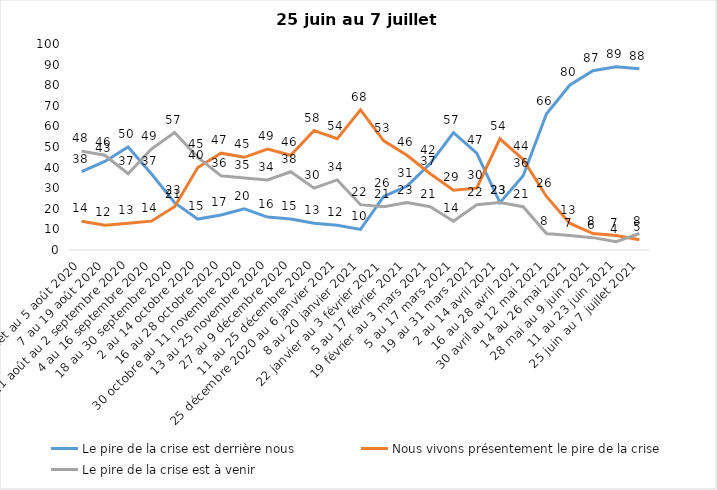
| Category | Le pire de la crise est derrière nous | Nous vivons présentement le pire de la crise | Le pire de la crise est à venir |
|---|---|---|---|
| 24 juillet au 5 août 2020 | 38 | 14 | 48 |
| 7 au 19 août 2020 | 43 | 12 | 46 |
| 21 août au 2 septembre 2020 | 50 | 13 | 37 |
| 4 au 16 septembre 2020 | 37 | 14 | 49 |
| 18 au 30 septembre 2020 | 23 | 21 | 57 |
| 2 au 14 octobre 2020 | 15 | 40 | 45 |
| 16 au 28 octobre 2020 | 17 | 47 | 36 |
| 30 octobre au 11 novembre 2020 | 20 | 45 | 35 |
| 13 au 25 novembre 2020 | 16 | 49 | 34 |
| 27 au 9 décembre 2020 | 15 | 46 | 38 |
| 11 au 25 décembre 2020 | 13 | 58 | 30 |
| 25 décembre 2020 au 6 janvier 2021 | 12 | 54 | 34 |
| 8 au 20 janvier 2021 | 10 | 68 | 22 |
| 22 janvier au 3 février 2021 | 26 | 53 | 21 |
| 5 au 17 février 2021 | 31 | 46 | 23 |
| 19 février au 3 mars 2021 | 42 | 37 | 21 |
| 5 au 17 mars 2021 | 57 | 29 | 14 |
| 19 au 31 mars 2021 | 47 | 30 | 22 |
| 2 au 14 avril 2021 | 23 | 54 | 23 |
| 16 au 28 avril 2021 | 36 | 44 | 21 |
| 30 avril au 12 mai 2021 | 66 | 26 | 8 |
| 14 au 26 mai 2021 | 80 | 13 | 7 |
| 28 mai au 9 juin 2021 | 87 | 8 | 6 |
| 11 au 23 juin 2021 | 89 | 7 | 4 |
| 25 juin au 7 juillet 2021 | 88 | 5 | 8 |